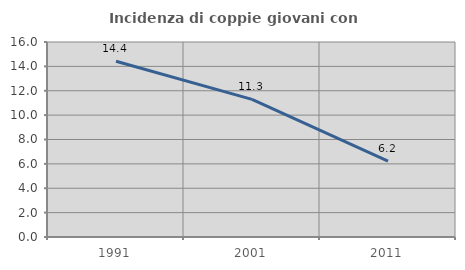
| Category | Incidenza di coppie giovani con figli |
|---|---|
| 1991.0 | 14.423 |
| 2001.0 | 11.29 |
| 2011.0 | 6.227 |